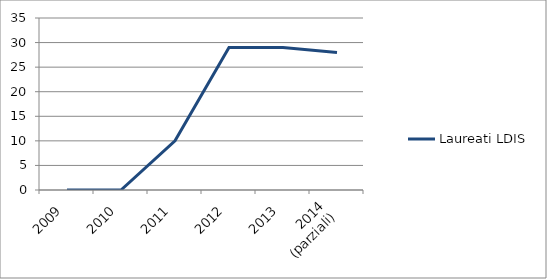
| Category | Laureati LDIS |
|---|---|
| 2009 | 0 |
| 2010 | 0 |
| 2011 | 10 |
| 2012 | 29 |
| 2013 | 29 |
| 2014
(parziali) | 28 |